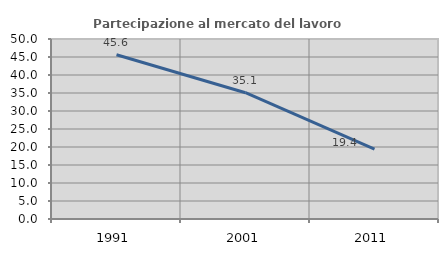
| Category | Partecipazione al mercato del lavoro  femminile |
|---|---|
| 1991.0 | 45.631 |
| 2001.0 | 35.085 |
| 2011.0 | 19.434 |